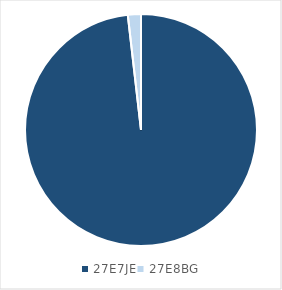
| Category | Series 0 |
|---|---|
| 27E7JE | 2858 |
| 27E8BG | 53 |